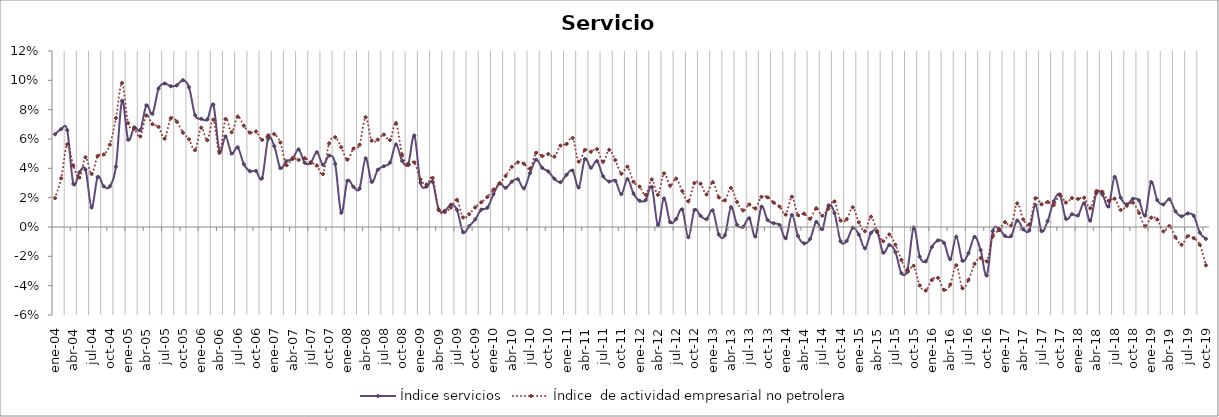
| Category | Índice servicios | Índice  de actividad empresarial no petrolera |
|---|---|---|
| 2004-01-01 | 0.063 | 0.02 |
| 2004-02-01 | 0.067 | 0.033 |
| 2004-03-01 | 0.066 | 0.056 |
| 2004-04-01 | 0.029 | 0.042 |
| 2004-05-01 | 0.037 | 0.034 |
| 2004-06-01 | 0.039 | 0.048 |
| 2004-07-01 | 0.013 | 0.036 |
| 2004-08-01 | 0.034 | 0.048 |
| 2004-09-01 | 0.028 | 0.049 |
| 2004-10-01 | 0.028 | 0.056 |
| 2004-11-01 | 0.041 | 0.074 |
| 2004-12-01 | 0.086 | 0.098 |
| 2005-01-01 | 0.06 | 0.071 |
| 2005-02-01 | 0.068 | 0.067 |
| 2005-03-01 | 0.066 | 0.062 |
| 2005-04-01 | 0.083 | 0.076 |
| 2005-05-01 | 0.077 | 0.07 |
| 2005-06-01 | 0.094 | 0.068 |
| 2005-07-01 | 0.098 | 0.06 |
| 2005-08-01 | 0.096 | 0.074 |
| 2005-09-01 | 0.097 | 0.072 |
| 2005-10-01 | 0.1 | 0.064 |
| 2005-11-01 | 0.095 | 0.06 |
| 2005-12-01 | 0.076 | 0.052 |
| 2006-01-01 | 0.074 | 0.068 |
| 2006-02-01 | 0.073 | 0.059 |
| 2006-03-01 | 0.083 | 0.073 |
| 2006-04-01 | 0.052 | 0.051 |
| 2006-05-01 | 0.062 | 0.074 |
| 2006-06-01 | 0.05 | 0.065 |
| 2006-07-01 | 0.054 | 0.075 |
| 2006-08-01 | 0.043 | 0.069 |
| 2006-09-01 | 0.038 | 0.064 |
| 2006-10-01 | 0.038 | 0.065 |
| 2006-11-01 | 0.033 | 0.059 |
| 2006-12-01 | 0.06 | 0.062 |
| 2007-01-01 | 0.055 | 0.063 |
| 2007-02-01 | 0.04 | 0.058 |
| 2007-03-01 | 0.045 | 0.042 |
| 2007-04-01 | 0.046 | 0.047 |
| 2007-05-01 | 0.053 | 0.046 |
| 2007-06-01 | 0.044 | 0.047 |
| 2007-07-01 | 0.044 | 0.044 |
| 2007-08-01 | 0.051 | 0.042 |
| 2007-09-01 | 0.042 | 0.036 |
| 2007-10-01 | 0.049 | 0.057 |
| 2007-11-01 | 0.043 | 0.061 |
| 2007-12-01 | 0.01 | 0.054 |
| 2008-01-01 | 0.031 | 0.046 |
| 2008-02-01 | 0.027 | 0.053 |
| 2008-03-01 | 0.026 | 0.056 |
| 2008-04-01 | 0.047 | 0.075 |
| 2008-05-01 | 0.031 | 0.059 |
| 2008-06-01 | 0.039 | 0.06 |
| 2008-07-01 | 0.041 | 0.063 |
| 2008-08-01 | 0.044 | 0.059 |
| 2008-09-01 | 0.056 | 0.071 |
| 2008-10-01 | 0.045 | 0.049 |
| 2008-11-01 | 0.043 | 0.042 |
| 2008-12-01 | 0.062 | 0.044 |
| 2009-01-01 | 0.03 | 0.033 |
| 2009-02-01 | 0.027 | 0.029 |
| 2009-03-01 | 0.031 | 0.033 |
| 2009-04-01 | 0.012 | 0.012 |
| 2009-05-01 | 0.011 | 0.01 |
| 2009-06-01 | 0.015 | 0.013 |
| 2009-07-01 | 0.012 | 0.019 |
| 2009-08-01 | -0.004 | 0.006 |
| 2009-09-01 | 0 | 0.009 |
| 2009-10-01 | 0.005 | 0.013 |
| 2009-11-01 | 0.012 | 0.017 |
| 2009-12-01 | 0.013 | 0.02 |
| 2010-01-01 | 0.022 | 0.026 |
| 2010-02-01 | 0.03 | 0.03 |
| 2010-03-01 | 0.027 | 0.035 |
| 2010-04-01 | 0.031 | 0.041 |
| 2010-05-01 | 0.033 | 0.044 |
| 2010-06-01 | 0.026 | 0.043 |
| 2010-07-01 | 0.037 | 0.04 |
| 2010-08-01 | 0.046 | 0.051 |
| 2010-09-01 | 0.04 | 0.048 |
| 2010-10-01 | 0.038 | 0.05 |
| 2010-11-01 | 0.033 | 0.048 |
| 2010-12-01 | 0.031 | 0.055 |
| 2011-01-01 | 0.036 | 0.057 |
| 2011-02-01 | 0.039 | 0.061 |
| 2011-03-01 | 0.027 | 0.045 |
| 2011-04-01 | 0.046 | 0.053 |
| 2011-05-01 | 0.04 | 0.051 |
| 2011-06-01 | 0.045 | 0.053 |
| 2011-07-01 | 0.035 | 0.044 |
| 2011-08-01 | 0.031 | 0.053 |
| 2011-09-01 | 0.032 | 0.046 |
| 2011-10-01 | 0.022 | 0.036 |
| 2011-11-01 | 0.033 | 0.041 |
| 2011-12-01 | 0.023 | 0.031 |
| 2012-01-01 | 0.018 | 0.028 |
| 2012-02-01 | 0.018 | 0.022 |
| 2012-03-01 | 0.027 | 0.032 |
| 2012-04-01 | 0.001 | 0.022 |
| 2012-05-01 | 0.02 | 0.037 |
| 2012-06-01 | 0.003 | 0.028 |
| 2012-07-01 | 0.005 | 0.033 |
| 2012-08-01 | 0.012 | 0.024 |
| 2012-09-01 | -0.007 | 0.018 |
| 2012-10-01 | 0.012 | 0.03 |
| 2012-11-01 | 0.008 | 0.03 |
| 2012-12-01 | 0.005 | 0.022 |
| 2013-01-01 | 0.011 | 0.031 |
| 2013-02-01 | -0.005 | 0.02 |
| 2013-03-01 | -0.006 | 0.018 |
| 2013-04-01 | 0.014 | 0.027 |
| 2013-05-01 | 0.002 | 0.017 |
| 2013-06-01 | 0 | 0.011 |
| 2013-07-01 | 0.006 | 0.015 |
| 2013-08-01 | -0.007 | 0.013 |
| 2013-09-01 | 0.014 | 0.021 |
| 2013-10-01 | 0.005 | 0.02 |
| 2013-11-01 | 0.003 | 0.017 |
| 2013-12-01 | 0.001 | 0.014 |
| 2014-01-01 | -0.008 | 0.008 |
| 2014-02-01 | 0.008 | 0.021 |
| 2014-03-01 | -0.006 | 0.008 |
| 2014-04-01 | -0.011 | 0.009 |
| 2014-05-01 | -0.008 | 0.006 |
| 2014-06-01 | 0.003 | 0.013 |
| 2014-07-01 | -0.001 | 0.008 |
| 2014-08-01 | 0.015 | 0.013 |
| 2014-09-01 | 0.01 | 0.017 |
| 2014-10-01 | -0.01 | 0.004 |
| 2014-11-01 | -0.01 | 0.005 |
| 2014-12-01 | 0 | 0.013 |
| 2015-01-01 | -0.005 | 0.003 |
| 2015-02-01 | -0.015 | -0.003 |
| 2015-03-01 | -0.004 | 0.007 |
| 2015-04-01 | -0.003 | -0.003 |
| 2015-05-01 | -0.018 | -0.01 |
| 2015-06-01 | -0.012 | -0.005 |
| 2015-07-01 | -0.017 | -0.012 |
| 2015-08-01 | -0.032 | -0.023 |
| 2015-09-01 | -0.029 | -0.031 |
| 2015-10-01 | 0 | -0.026 |
| 2015-11-01 | -0.02 | -0.04 |
| 2015-12-01 | -0.023 | -0.043 |
| 2016-01-01 | -0.014 | -0.036 |
| 2016-02-01 | -0.009 | -0.035 |
| 2016-03-01 | -0.011 | -0.043 |
| 2016-04-01 | -0.022 | -0.039 |
| 2016-05-01 | -0.007 | -0.026 |
| 2016-06-01 | -0.023 | -0.042 |
| 2016-07-01 | -0.018 | -0.036 |
| 2016-08-01 | -0.007 | -0.025 |
| 2016-09-01 | -0.016 | -0.021 |
| 2016-10-01 | -0.033 | -0.023 |
| 2016-11-01 | -0.003 | -0.006 |
| 2016-12-01 | -0.001 | -0.002 |
| 2017-01-01 | -0.006 | 0.003 |
| 2017-02-01 | -0.006 | 0.001 |
| 2017-03-01 | 0.004 | 0.016 |
| 2017-04-01 | -0.002 | 0.005 |
| 2017-05-01 | -0.002 | 0.002 |
| 2017-06-01 | 0.015 | 0.02 |
| 2017-07-01 | -0.003 | 0.015 |
| 2017-08-01 | 0.004 | 0.017 |
| 2017-09-01 | 0.017 | 0.015 |
| 2017-10-01 | 0.022 | 0.022 |
| 2017-11-01 | 0.006 | 0.017 |
| 2017-12-01 | 0.009 | 0.02 |
| 2018-01-01 | 0.008 | 0.019 |
| 2018-02-01 | 0.016 | 0.02 |
| 2018-03-01 | 0.004 | 0.013 |
| 2018-04-01 | 0.023 | 0.024 |
| 2018-05-01 | 0.022 | 0.024 |
| 2018-06-01 | 0.014 | 0.018 |
| 2018-07-01 | 0.034 | 0.019 |
| 2018-08-01 | 0.02 | 0.012 |
| 2018-09-01 | 0.015 | 0.014 |
| 2018-10-01 | 0.019 | 0.017 |
| 2018-11-01 | 0.018 | 0.01 |
| 2018-12-01 | 0.008 | 0 |
| 2019-01-01 | 0.031 | 0.006 |
| 2019-02-01 | 0.018 | 0.005 |
| 2019-03-01 | 0.015 | -0.003 |
| 2019-04-01 | 0.019 | 0.001 |
| 2019-05-01 | 0.011 | -0.007 |
| 2019-06-01 | 0.007 | -0.012 |
| 2019-07-01 | 0.009 | -0.006 |
| 2019-08-01 | 0.008 | -0.008 |
| 2019-09-01 | -0.004 | -0.012 |
| 2019-10-01 | -0.008 | -0.026 |